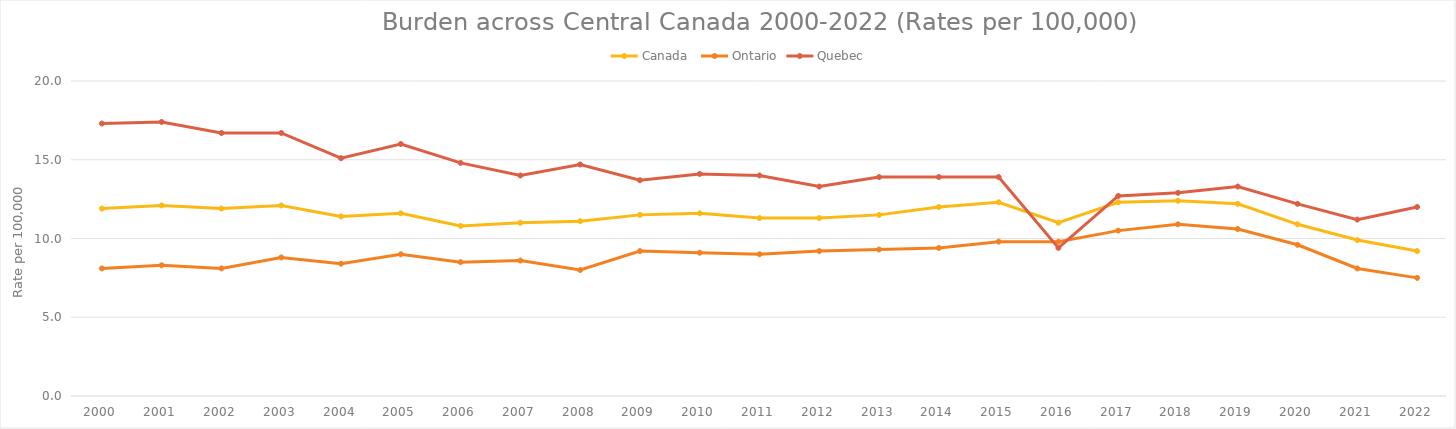
| Category | Canada  | Ontario | Quebec |
|---|---|---|---|
| 2000.0 | 11.9 | 8.1 | 17.3 |
| 2001.0 | 12.1 | 8.3 | 17.4 |
| 2002.0 | 11.9 | 8.1 | 16.7 |
| 2003.0 | 12.1 | 8.8 | 16.7 |
| 2004.0 | 11.4 | 8.4 | 15.1 |
| 2005.0 | 11.6 | 9 | 16 |
| 2006.0 | 10.8 | 8.5 | 14.8 |
| 2007.0 | 11 | 8.6 | 14 |
| 2008.0 | 11.1 | 8 | 14.7 |
| 2009.0 | 11.5 | 9.2 | 13.7 |
| 2010.0 | 11.6 | 9.1 | 14.1 |
| 2011.0 | 11.3 | 9 | 14 |
| 2012.0 | 11.3 | 9.2 | 13.3 |
| 2013.0 | 11.5 | 9.3 | 13.9 |
| 2014.0 | 12 | 9.4 | 13.9 |
| 2015.0 | 12.3 | 9.8 | 13.9 |
| 2016.0 | 11 | 9.8 | 9.4 |
| 2017.0 | 12.3 | 10.5 | 12.7 |
| 2018.0 | 12.4 | 10.9 | 12.9 |
| 2019.0 | 12.2 | 10.6 | 13.3 |
| 2020.0 | 10.9 | 9.6 | 12.2 |
| 2021.0 | 9.9 | 8.1 | 11.2 |
| 2022.0 | 9.2 | 7.5 | 12 |